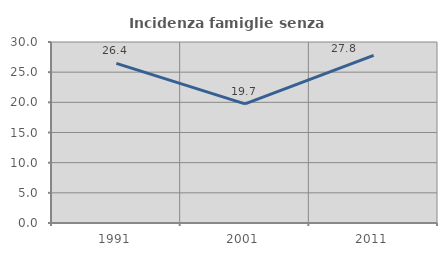
| Category | Incidenza famiglie senza nuclei |
|---|---|
| 1991.0 | 26.446 |
| 2001.0 | 19.735 |
| 2011.0 | 27.784 |